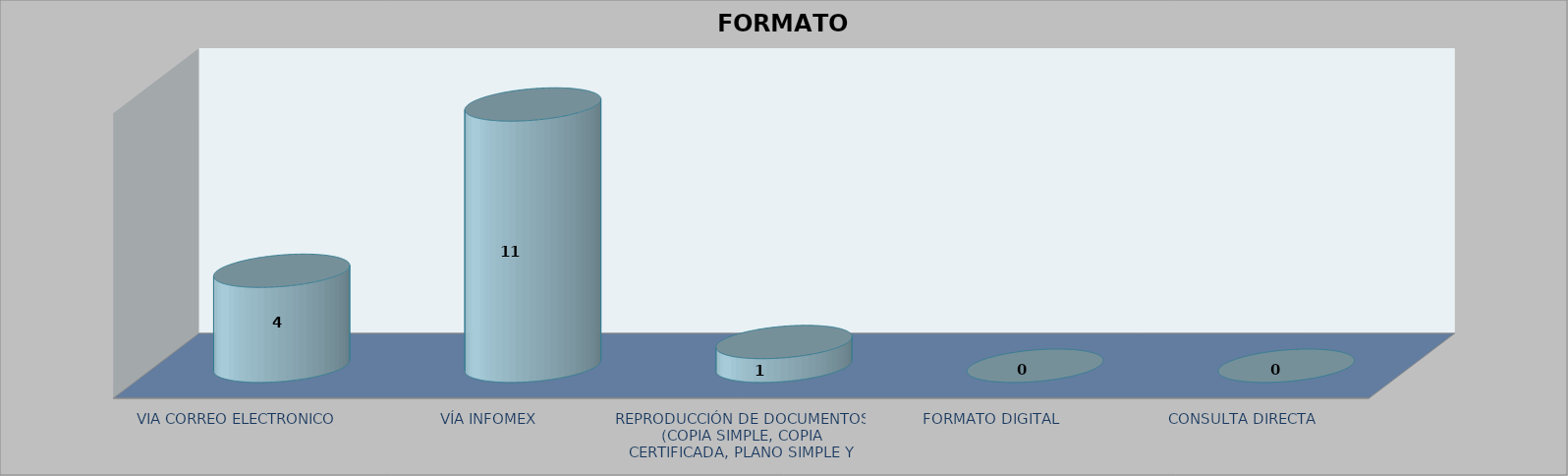
| Category |        FORMATO SOLICITADO | Series 1 | Series 2 |
|---|---|---|---|
| VIA CORREO ELECTRONICO |  |  | 4 |
| VÍA INFOMEX |  |  | 11 |
| REPRODUCCIÓN DE DOCUMENTOS (COPIA SIMPLE, COPIA CERTIFICADA, PLANO SIMPLE Y PLANO CERTIFICADO) |  |  | 1 |
| FORMATO DIGITAL |  |  | 0 |
| CONSULTA DIRECTA |  |  | 0 |